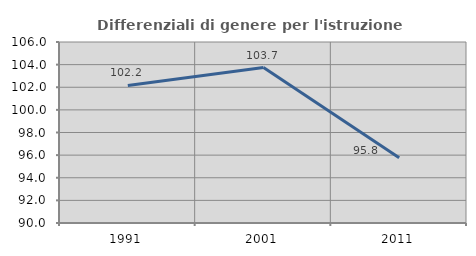
| Category | Differenziali di genere per l'istruzione superiore |
|---|---|
| 1991.0 | 102.159 |
| 2001.0 | 103.739 |
| 2011.0 | 95.776 |